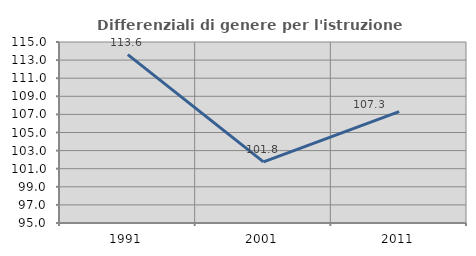
| Category | Differenziali di genere per l'istruzione superiore |
|---|---|
| 1991.0 | 113.6 |
| 2001.0 | 101.762 |
| 2011.0 | 107.316 |